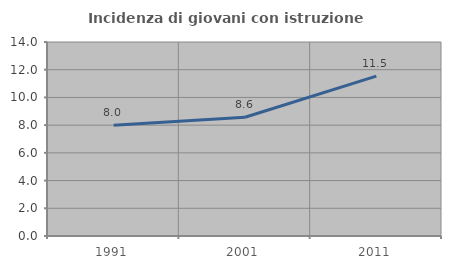
| Category | Incidenza di giovani con istruzione universitaria |
|---|---|
| 1991.0 | 8 |
| 2001.0 | 8.571 |
| 2011.0 | 11.538 |